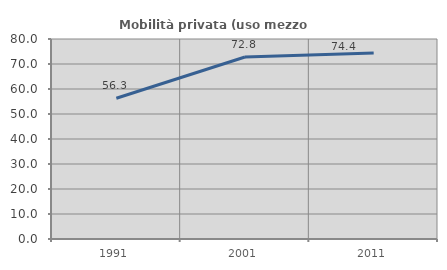
| Category | Mobilità privata (uso mezzo privato) |
|---|---|
| 1991.0 | 56.296 |
| 2001.0 | 72.794 |
| 2011.0 | 74.375 |